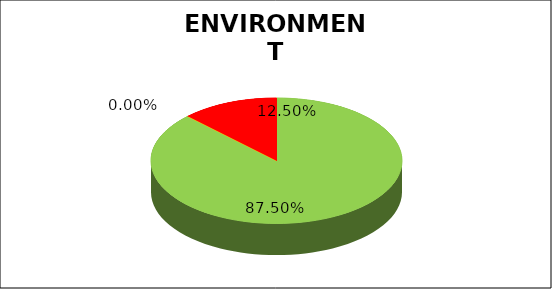
| Category | Series 0 |
|---|---|
| Green | 0.875 |
| Amber | 0 |
| Red | 0.125 |